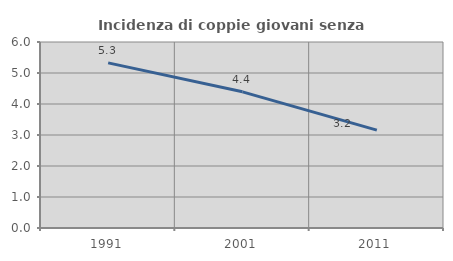
| Category | Incidenza di coppie giovani senza figli |
|---|---|
| 1991.0 | 5.326 |
| 2001.0 | 4.393 |
| 2011.0 | 3.157 |